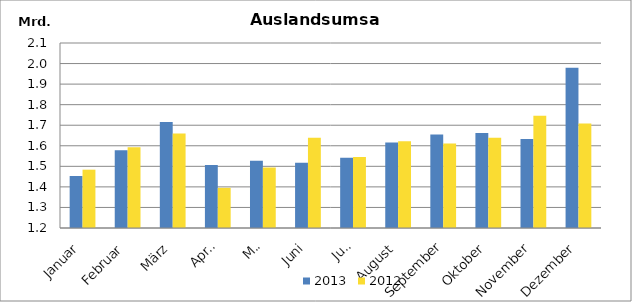
| Category | 2013 | 2012 |
|---|---|---|
| Januar | 1453122.458 | 1483735.784 |
| Februar | 1578148.43 | 1593314.446 |
| März | 1716184.371 | 1659193.916 |
| April | 1506621.949 | 1395302.267 |
| Mai | 1527198.509 | 1494307.771 |
| Juni | 1517924.72 | 1639126.68 |
| Juli | 1541709.864 | 1545639.666 |
| August | 1615613.522 | 1622306.882 |
| September | 1655102.791 | 1611324.819 |
| Oktober | 1661614.212 | 1638670.797 |
| November | 1632864.215 | 1746547.228 |
| Dezember | 1979533.645 | 1707786.435 |